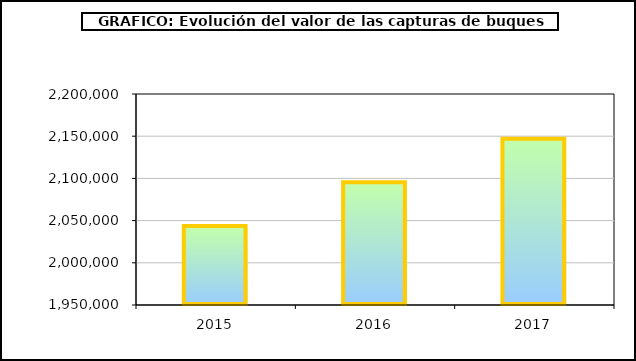
| Category | Series1 |
|---|---|
| 0 | 2043456.849 |
| 1 | 2095551.387 |
| 2 | 2147014.107 |